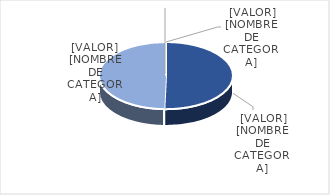
| Category | Series 0 |
|---|---|
| PRESUPUESTO VIGENTE PARA 2023 | 25692967 |
| PRESUPUESTO EJECUTADO  | 25284844.78 |
| PORCENTAJE DE EJECUCIÓN  | 0.984 |